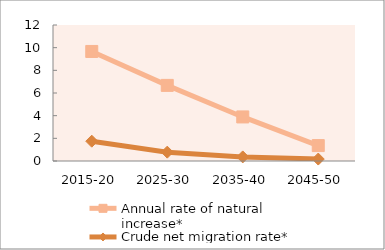
| Category | Annual rate of natural increase* | Crude net migration rate* |
|---|---|---|
| 2015-20 | 9.665 | 1.747 |
| 2025-30 | 6.672 | 0.78 |
| 2035-40 | 3.888 | 0.361 |
| 2045-50 | 1.36 | 0.172 |